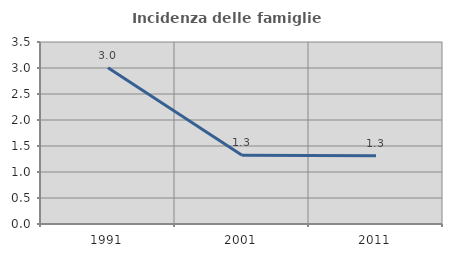
| Category | Incidenza delle famiglie numerose |
|---|---|
| 1991.0 | 3.004 |
| 2001.0 | 1.323 |
| 2011.0 | 1.313 |